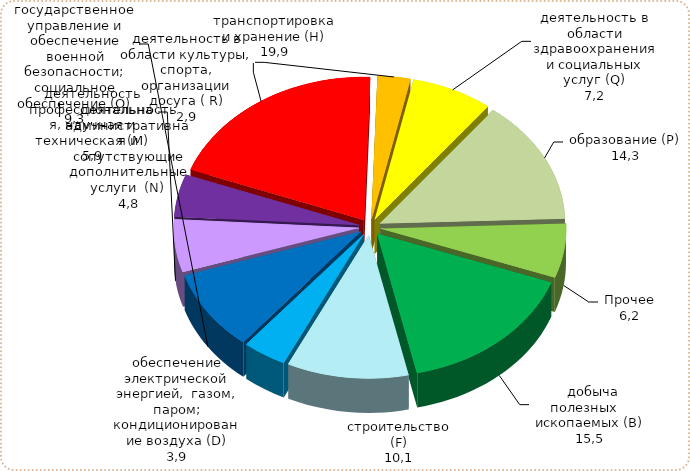
| Category | Series 3 | Series 2 | Series 1 | Series 0 |
|---|---|---|---|---|
|     добыча   полезных    ископаемых (В) | 15.986 |  |  |  |
| строительство (F) | 10.604 |  |  |  |
| обеспечение электрической энергией,  газом, паром; кондиционирование воздуха (D) | 3.814 |  |  |  |
| государственное управление и обеспечение военной безопасности; социальное обеспечение (О) | 9.061 |  |  |  |
| деятельность профессиональная, научная и техническая (М) | 5.933 |  |  |  |
| деятельность административная и сопутствующие дополнительные услуги  (N) | 4.776 |  |  |  |
| транспортировка и хранение (H) | 19.794 |  |  |  |
| деятельность в области культуры, спорта, организации досуга ( R) | 2.847 |  |  |  |
| деятельность в области здравоохранения и социальных услуг (Q) | 7.09 |  |  |  |
| образование (Р) | 13.996 |  |  |  |
| Прочее | 6.098 |  |  |  |